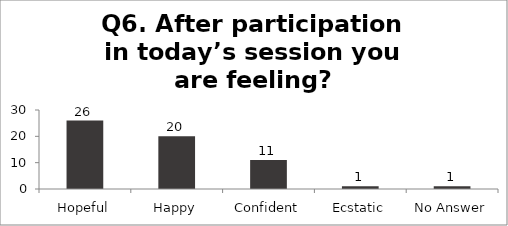
| Category | Q6. After participation in today’s session you are feeling? |
|---|---|
| Hopeful | 26 |
| Happy | 20 |
| Confident | 11 |
| Ecstatic | 1 |
| No Answer | 1 |